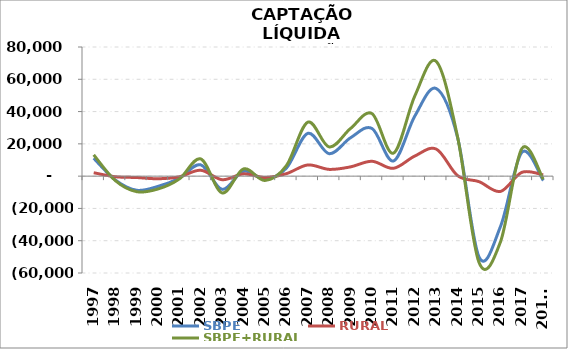
| Category | SBPE | RURAL | SBPE+RURAL |
|---|---|---|---|
| 1997 | 11079 | 2113.852 | 13192.852 |
| 1998 | -2301.5 | -361.228 | -2662.728 |
| 1999 | -8740.2 | -858.508 | -9598.708 |
| 2000 | -6355.964 | -1615.457 | -7971.421 |
| 2001 | -1319.381 | -412.963 | -1732.344 |
| 2002 | 7008.282 | 3649.972 | 10658.254 |
| 2003 | -8178.886 | -2213.868 | -10392.754 |
| 2004 | 3057.299 | 1425.147 | 4482.446 |
| 2005 | -1869.531 | -826.948 | -2696.479 |
| 2006 | 4963.736 | 1532.919 | 6496.655 |
| 2007 | 26493.6 | 6927.358 | 33420.958 |
| 2008 | 13900.71 | 4187.043 | 18087.753 |
| 2009 | 23813.033 | 5752.651 | 29565.684 |
| 2010 | 29513.472 | 9213.301 | 38726.773 |
| 2011 | 9382.932 | 4844.657 | 14227.589 |
| 2012 | 37239.575 | 12479.984 | 49719.559 |
| 2013 | 54280.749 | 16766.843 | 71047.592 |
| 2014 | 23758.558 | 275.423 | 24033.981 |
| 2015 | -50149.363 | -3418.504 | -53567.867 |
| 2016 | -31222.546 | -9479.207 | -40701.753 |
| 2017 | 14774.799 | 2351.903 | 17126.702 |
| 2018* | -2708.602 | 777.095 | -1931.507 |